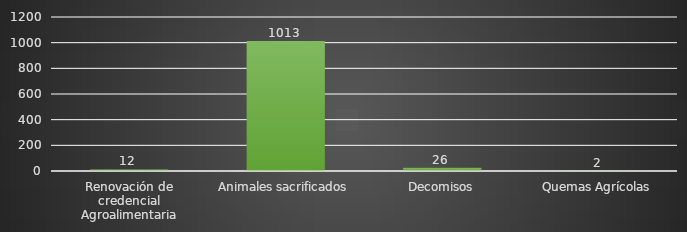
| Category | INDICADOR  |
|---|---|
| Renovación de credencial Agroalimentaria | 12 |
| Animales sacrificados | 1013 |
| Decomisos | 26 |
| Quemas Agrícolas | 2 |